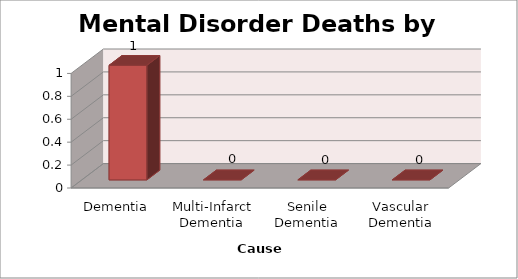
| Category | Series 0 |
|---|---|
| Dementia | 1 |
| Multi-Infarct Dementia | 0 |
| Senile Dementia | 0 |
| Vascular Dementia | 0 |